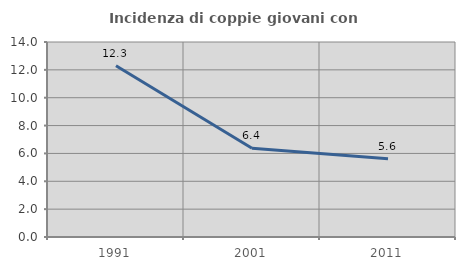
| Category | Incidenza di coppie giovani con figli |
|---|---|
| 1991.0 | 12.295 |
| 2001.0 | 6.369 |
| 2011.0 | 5.621 |